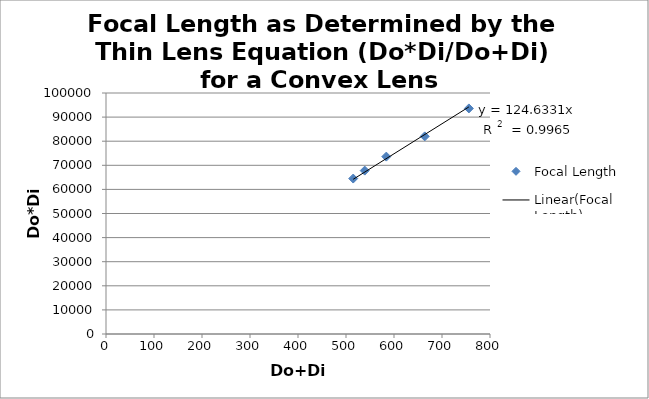
| Category | Focal Length |
|---|---|
| 539.0 | 67800 |
| 515.0 | 64500 |
| 584.0 | 73600 |
| 664.0 | 82000 |
| 756.0 | 93600 |